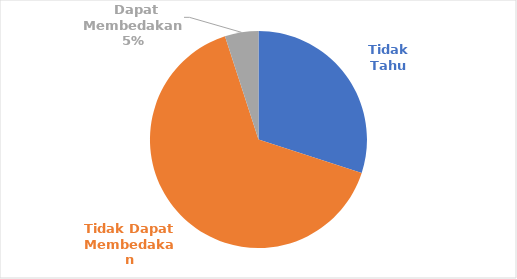
| Category | Indikator Proporsi Ikan Yuwana (Juvenile) yang Ditangkap |
|---|---|
| Tidak Tahu | 12 |
| Tidak Dapat Membedakan | 26 |
|  Dapat Membedakan  | 2 |